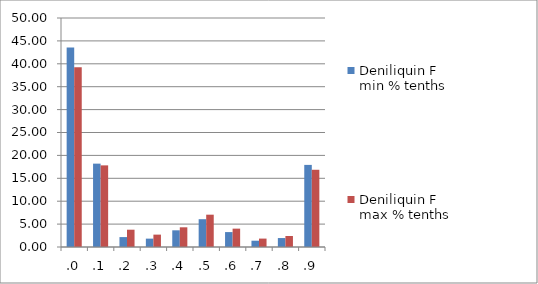
| Category | Deniliquin F min % tenths | Deniliquin F max % tenths |
|---|---|---|
| .0 | 43.582 | 39.235 |
| .1 | 18.201 | 17.823 |
| .2 | 2.164 | 3.778 |
| .3 | 1.826 | 2.702 |
| .4 | 3.644 | 4.3 |
| .5 | 6.071 | 7.057 |
| .6 | 3.257 | 4.01 |
| .7 | 1.375 | 1.835 |
| .8 | 1.953 | 2.399 |
| .9 | 17.927 | 16.862 |